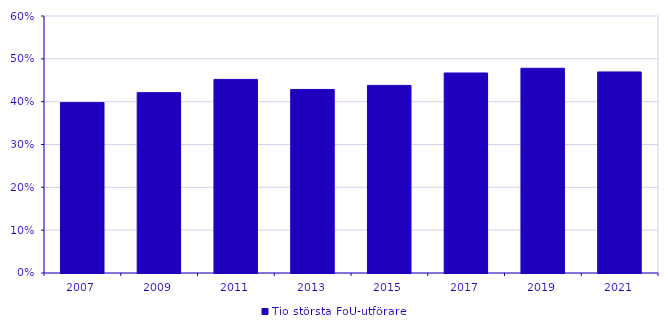
| Category | Tio största FoU-utförare |
|---|---|
| 2007.0 | 0.398 |
| 2009.0 | 0.421 |
| 2011.0 | 0.452 |
| 2013.0 | 0.429 |
| 2015.0 | 0.438 |
| 2017.0 | 0.467 |
| 2019.0 | 0.478 |
| 2021.0 | 0.469 |